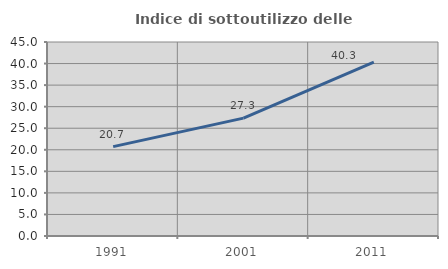
| Category | Indice di sottoutilizzo delle abitazioni  |
|---|---|
| 1991.0 | 20.736 |
| 2001.0 | 27.337 |
| 2011.0 | 40.312 |